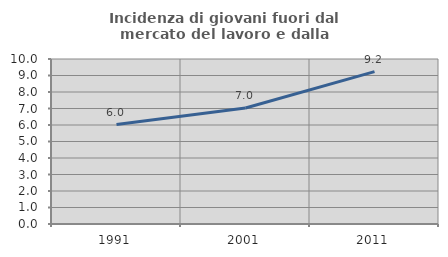
| Category | Incidenza di giovani fuori dal mercato del lavoro e dalla formazione  |
|---|---|
| 1991.0 | 6.03 |
| 2001.0 | 7.029 |
| 2011.0 | 9.238 |